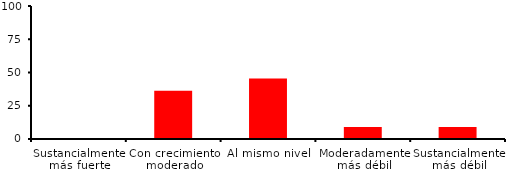
| Category | Series 0 |
|---|---|
| Sustancialmente más fuerte | 0 |
| Con crecimiento moderado | 36.364 |
| Al mismo nivel | 45.455 |
| Moderadamente más débil | 9.091 |
| Sustancialmente más débil | 9.091 |